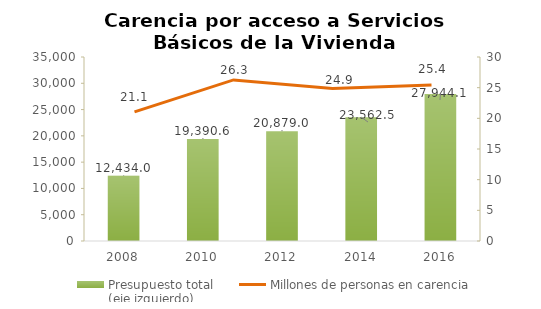
| Category | Presupuesto total
(eje izquierdo) |
|---|---|
| 2008.0 | 12433977158.499 |
| 2010.0 | 19390628522.076 |
| 2012.0 | 20878984397.221 |
| 2014.0 | 23562494386.569 |
| 2016.0 | 27944137397 |